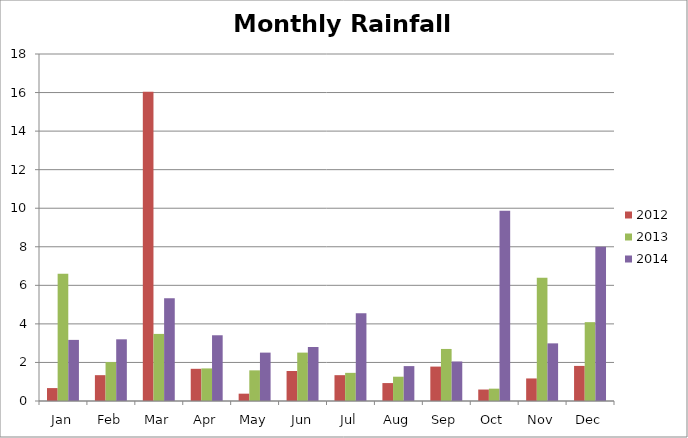
| Category | 2012 | 2013 | 2014 |
|---|---|---|---|
| Jan | 0.67 | 6.6 | 3.17 |
| Feb | 1.34 | 2.02 | 3.2 |
| Mar | 16.04 | 3.48 | 5.33 |
| Apr | 1.67 | 1.69 | 3.41 |
| May | 0.38 | 1.59 | 2.51 |
| Jun | 1.555 | 2.51 | 2.8 |
| Jul | 1.34 | 1.46 | 4.55 |
| Aug | 0.93 | 1.26 | 1.81 |
| Sep | 1.785 | 2.7 | 2.05 |
| Oct | 0.595 | 0.64 | 9.87 |
| Nov | 1.17 | 6.39 | 2.99 |
| Dec | 1.82 | 4.09 | 8 |